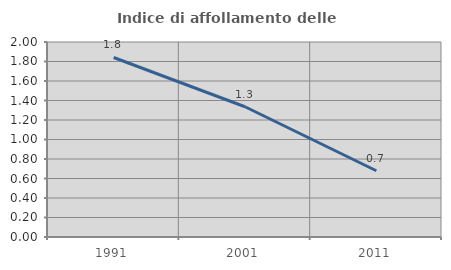
| Category | Indice di affollamento delle abitazioni  |
|---|---|
| 1991.0 | 1.841 |
| 2001.0 | 1.336 |
| 2011.0 | 0.68 |